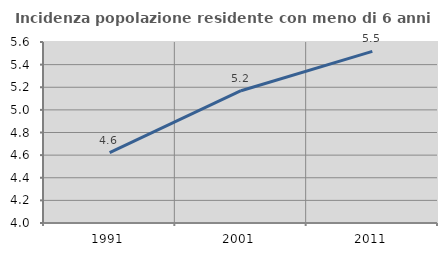
| Category | Incidenza popolazione residente con meno di 6 anni |
|---|---|
| 1991.0 | 4.621 |
| 2001.0 | 5.169 |
| 2011.0 | 5.517 |